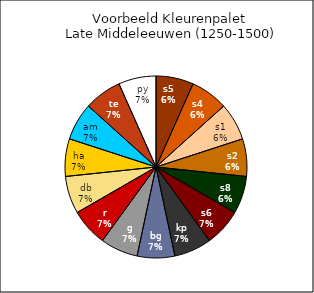
| Category | Series 0 |
|---|---|
| s5 | 1 |
| s4 | 1 |
| s1 | 1 |
| s2 | 1 |
| s8 | 1 |
| s6 | 1 |
| kp | 1 |
| bg | 1 |
| g | 1 |
| r | 1 |
| db | 1 |
| ha | 1 |
| am | 1 |
| te | 1 |
| py | 1 |